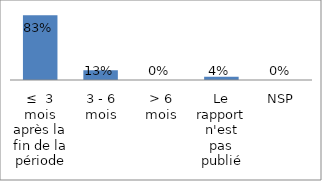
| Category | Series 0 |
|---|---|
| ≤  3 mois après la fin de la période | 0.833 |
| 3 - 6 mois | 0.125 |
| > 6 mois | 0 |
| Le rapport n'est pas publié | 0.042 |
| NSP | 0 |